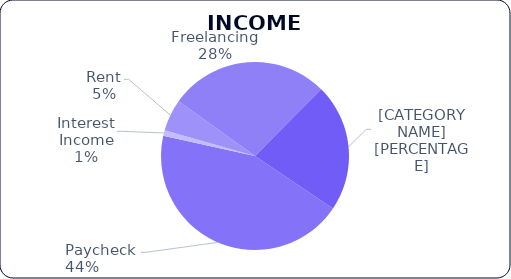
| Category | Actual |
|---|---|
| Paycheck | 4000 |
| Interest Income | 85 |
| Rent | 500 |
| Freelancing | 2500 |
| Business | 2000 |